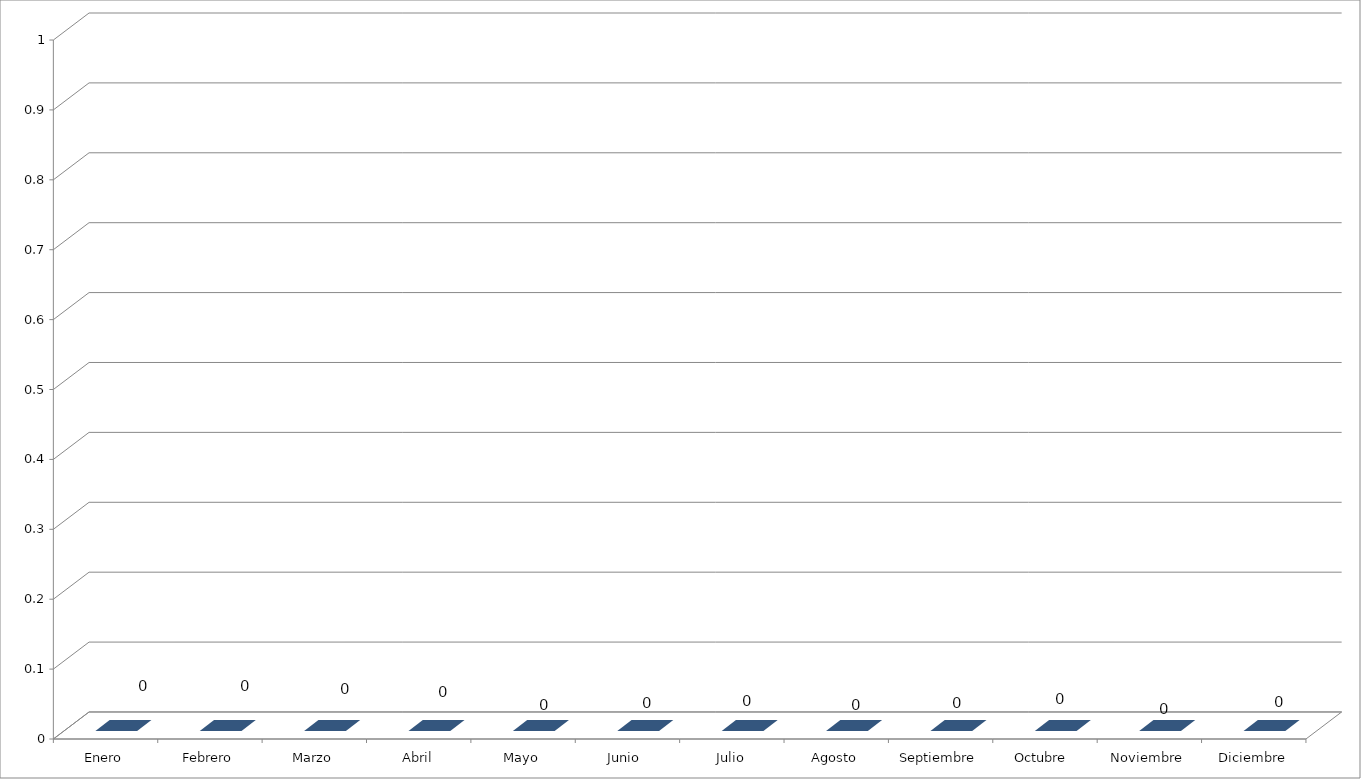
| Category | Series 0 |
|---|---|
| Enero | 0 |
| Febrero | 0 |
| Marzo | 0 |
| Abril | 0 |
| Mayo | 0 |
| Junio  | 0 |
| Julio | 0 |
| Agosto | 0 |
| Septiembre | 0 |
| Octubre  | 0 |
| Noviembre | 0 |
| Diciembre | 0 |